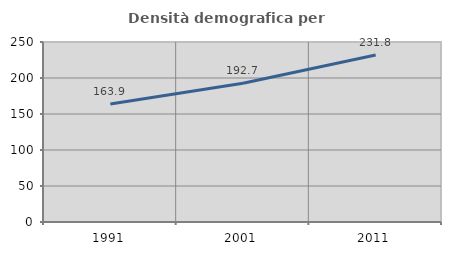
| Category | Densità demografica |
|---|---|
| 1991.0 | 163.876 |
| 2001.0 | 192.704 |
| 2011.0 | 231.835 |